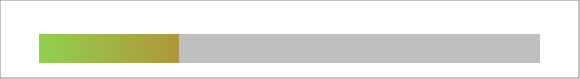
| Category | Series 0 |
|---|---|
| 0 | -0.252 |